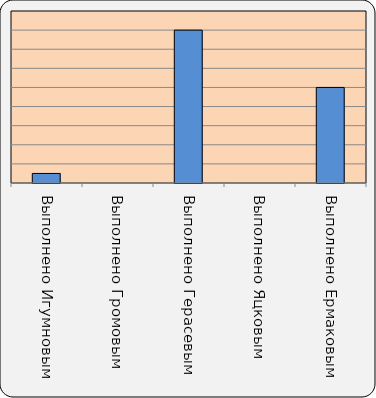
| Category | Series 0 |
|---|---|
| Выполнено Игумновым | 1 |
| Выполнено Громовым | 0 |
| Выполнено Герасевым | 16 |
| Выполнено Яцковым | 0 |
| Выполнено Ермаковым | 10 |